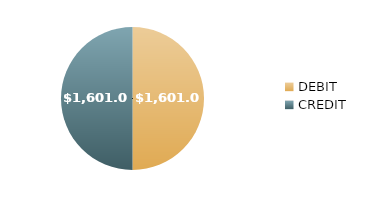
| Category | $1,601.00 |
|---|---|
| DEBIT | 1601 |
| CREDIT | 1601 |